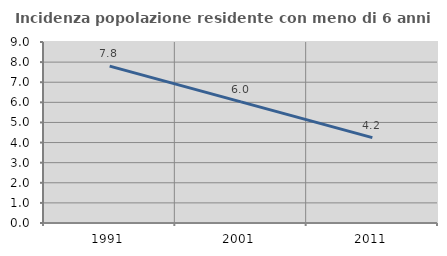
| Category | Incidenza popolazione residente con meno di 6 anni |
|---|---|
| 1991.0 | 7.803 |
| 2001.0 | 6.022 |
| 2011.0 | 4.244 |